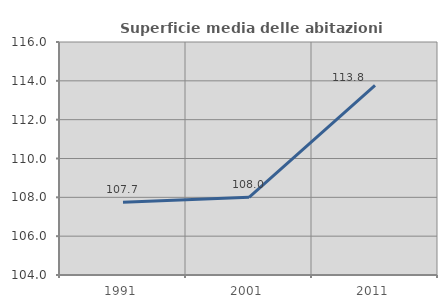
| Category | Superficie media delle abitazioni occupate |
|---|---|
| 1991.0 | 107.749 |
| 2001.0 | 108.001 |
| 2011.0 | 113.765 |